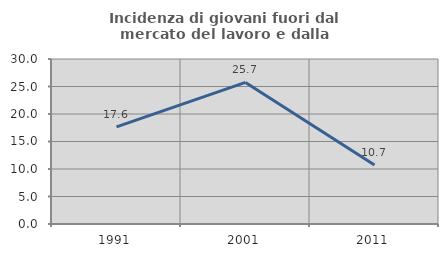
| Category | Incidenza di giovani fuori dal mercato del lavoro e dalla formazione  |
|---|---|
| 1991.0 | 17.647 |
| 2001.0 | 25.743 |
| 2011.0 | 10.714 |